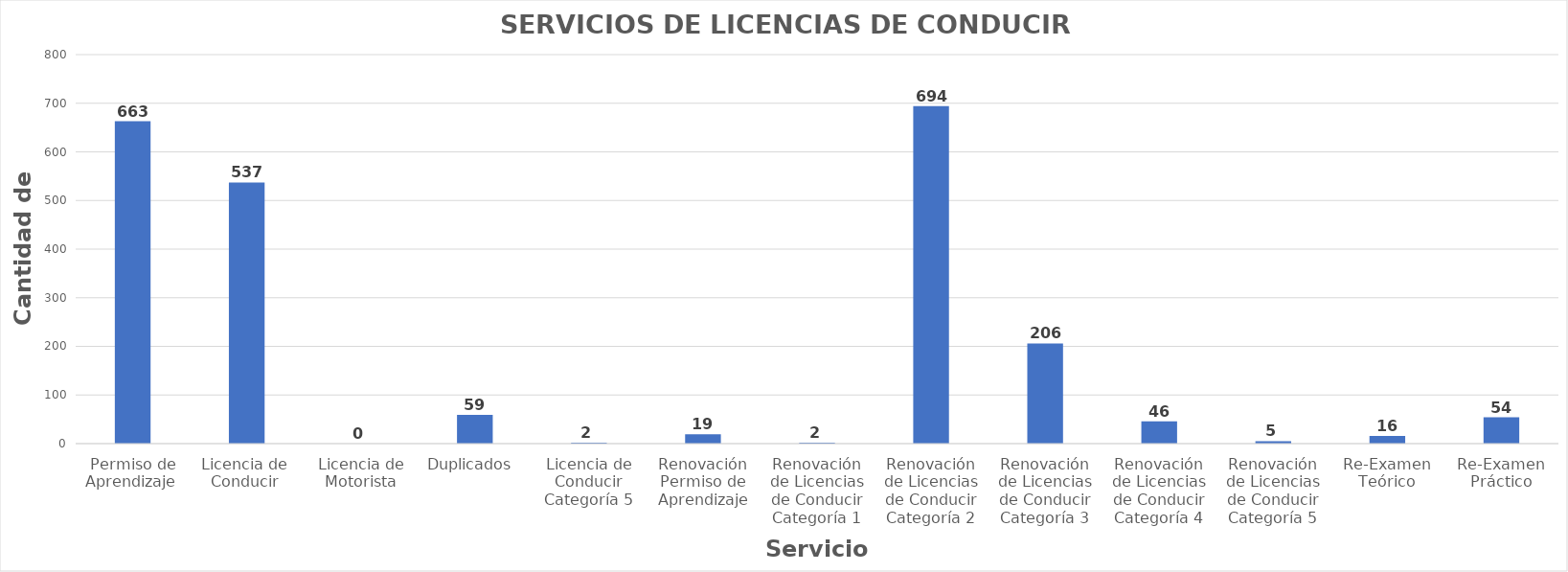
| Category | Series 0 |
|---|---|
| Permiso de Aprendizaje  | 663 |
| Licencia de  Conducir  | 537 |
| Licencia de Motorista | 0 |
| Duplicados  | 59 |
| Licencia de Conducir Categoría 5 | 2 |
| Renovación Permiso de Aprendizaje | 19 |
| Renovación de Licencias de Conducir Categoría 1 | 2 |
| Renovación de Licencias de Conducir Categoría 2 | 694 |
| Renovación de Licencias de Conducir Categoría 3 | 206 |
| Renovación de Licencias de Conducir Categoría 4 | 46 |
| Renovación de Licencias de Conducir Categoría 5 | 5 |
| Re-Examen Teórico | 16 |
| Re-Examen Práctico | 54 |